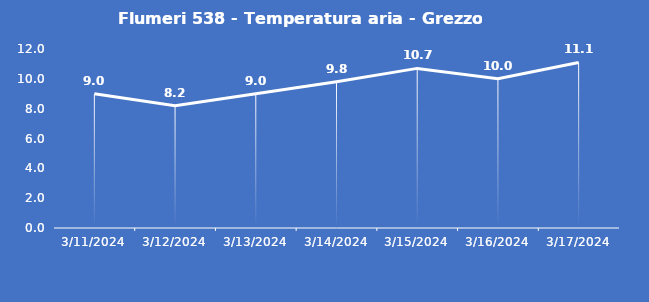
| Category | Flumeri 538 - Temperatura aria - Grezzo (°C) |
|---|---|
| 3/11/24 | 9 |
| 3/12/24 | 8.2 |
| 3/13/24 | 9 |
| 3/14/24 | 9.8 |
| 3/15/24 | 10.7 |
| 3/16/24 | 10 |
| 3/17/24 | 11.1 |